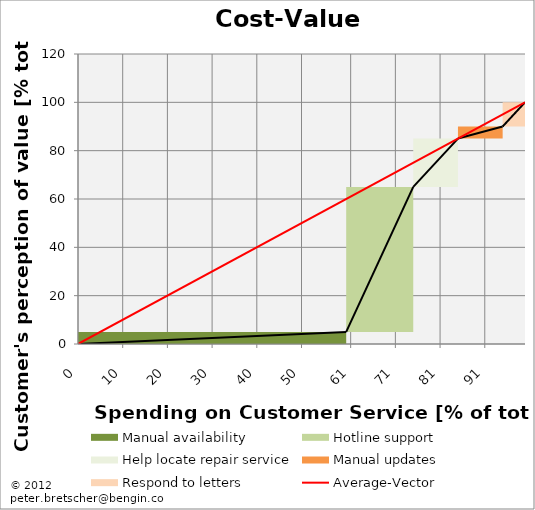
| Category | transparent | Manual availability | Hotline support | Help locate repair service | Manual updates | Respond to letters | none | Border right & top |
|---|---|---|---|---|---|---|---|---|
| 0.0 | 0 | 5 | 0 | 0 | 0 | 0 | 0 | 0 |
| 60.0 | 0 | 5 | 0 | 0 | 0 | 0 | 0 | 0 |
| 60.0 | 5 | 0 | 60 | 0 | 0 | 0 | 0 | 0 |
| 75.0 | 5 | 0 | 60 | 0 | 0 | 0 | 0 | 0 |
| 75.0 | 65 | 0 | 0 | 20 | 0 | 0 | 0 | 0 |
| 85.0 | 65 | 0 | 0 | 20 | 0 | 0 | 0 | 0 |
| 85.0 | 85 | 0 | 0 | 0 | 5 | 0 | 0 | 0 |
| 95.0 | 85 | 0 | 0 | 0 | 5 | 0 | 0 | 0 |
| 95.0 | 90 | 0 | 0 | 0 | 0 | 10 | 0 | 0 |
| 100.0 | 90 | 0 | 0 | 0 | 0 | 10 | 0 | 0 |
| 100.0 | 100 | 0 | 0 | 0 | 0 | 0 | 0 | 0 |
| 100.0 | 100 | 0 | 0 | 0 | 0 | 0 | 0 | 0 |
| 100.0 | 100 | 0 | 0 | 0 | 0 | 0 | 0 | 0 |
| 100.0 | 100 | 0 | 0 | 0 | 0 | 0 | 0 | 0 |
| 100.0 | 100 | 0 | 0 | 0 | 0 | 0 | 0 | 0 |
| 100.0 | 100 | 0 | 0 | 0 | 0 | 0 | 0 | 0 |
| 100.0 | 100 | 0 | 0 | 0 | 0 | 0 | 0 | 0 |
| 100.0 | 100 | 0 | 0 | 0 | 0 | 0 | 0 | 0 |
| 100.0 | 100 | 0 | 0 | 0 | 0 | 0 | 0 | 0 |
| 100.0 | 100 | 0 | 0 | 0 | 0 | 0 | 0 | 0 |
| 100.0 | 100 | 0 | 0 | 0 | 0 | 0 | 0 | 0 |
| 100.0 | 100 | 0 | 0 | 0 | 0 | 0 | 0 | 0 |
| 100.0 | 100 | 0 | 0 | 0 | 0 | 0 | 0 | 0 |